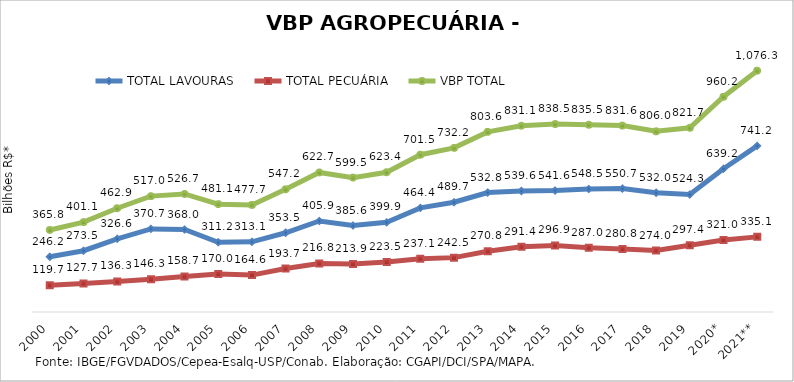
| Category | TOTAL LAVOURAS | TOTAL PECUÁRIA | VBP TOTAL |
|---|---|---|---|
| 2000 | 246.172 | 119.662 | 365.834 |
| 2001 | 273.452 | 127.664 | 401.115 |
| 2002 | 326.647 | 136.282 | 462.929 |
| 2003 | 370.742 | 146.275 | 517.017 |
| 2004 | 368.028 | 158.666 | 526.694 |
| 2005 | 311.151 | 169.971 | 481.121 |
| 2006 | 313.052 | 164.618 | 477.67 |
| 2007 | 353.535 | 193.664 | 547.199 |
| 2008 | 405.945 | 216.757 | 622.702 |
| 2009 | 385.594 | 213.937 | 599.532 |
| 2010 | 399.904 | 223.523 | 623.427 |
| 2011 | 464.439 | 237.101 | 701.54 |
| 2012 | 489.695 | 242.54 | 732.235 |
| 2013 | 532.791 | 270.767 | 803.558 |
| 2014 | 539.646 | 291.422 | 831.068 |
| 2015 | 541.604 | 296.879 | 838.483 |
| 2016 | 548.453 | 287.008 | 835.461 |
| 2017 | 550.73 | 280.841 | 831.571 |
| 2018 | 531.974 | 274.049 | 806.023 |
| 2019 | 524.324 | 297.422 | 821.746 |
| 2020* | 639.163 | 321.022 | 960.185 |
| 2021** | 741.202 | 335.14 | 1076.343 |